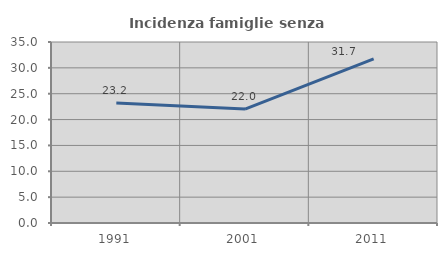
| Category | Incidenza famiglie senza nuclei |
|---|---|
| 1991.0 | 23.207 |
| 2001.0 | 22.031 |
| 2011.0 | 31.721 |